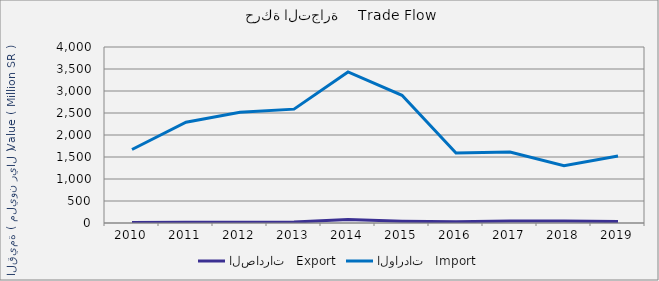
| Category | الصادرات   Export | الواردات   Import |
|---|---|---|
| 2010.0 | 11663224 | 1670722591 |
| 2011.0 | 14678345 | 2290555848 |
| 2012.0 | 16606425 | 2518471245 |
| 2013.0 | 21837565 | 2587918243 |
| 2014.0 | 81572230 | 3433044603 |
| 2015.0 | 41667612 | 2902176248 |
| 2016.0 | 27690195 | 1589848441 |
| 2017.0 | 47974067 | 1613732661 |
| 2018.0 | 44654325 | 1302164609 |
| 2019.0 | 31371188 | 1524316013 |